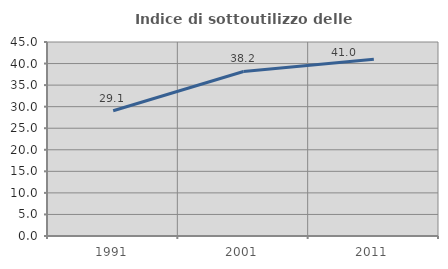
| Category | Indice di sottoutilizzo delle abitazioni  |
|---|---|
| 1991.0 | 29.055 |
| 2001.0 | 38.169 |
| 2011.0 | 41.012 |